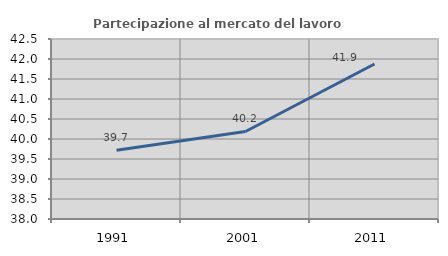
| Category | Partecipazione al mercato del lavoro  femminile |
|---|---|
| 1991.0 | 39.719 |
| 2001.0 | 40.188 |
| 2011.0 | 41.875 |